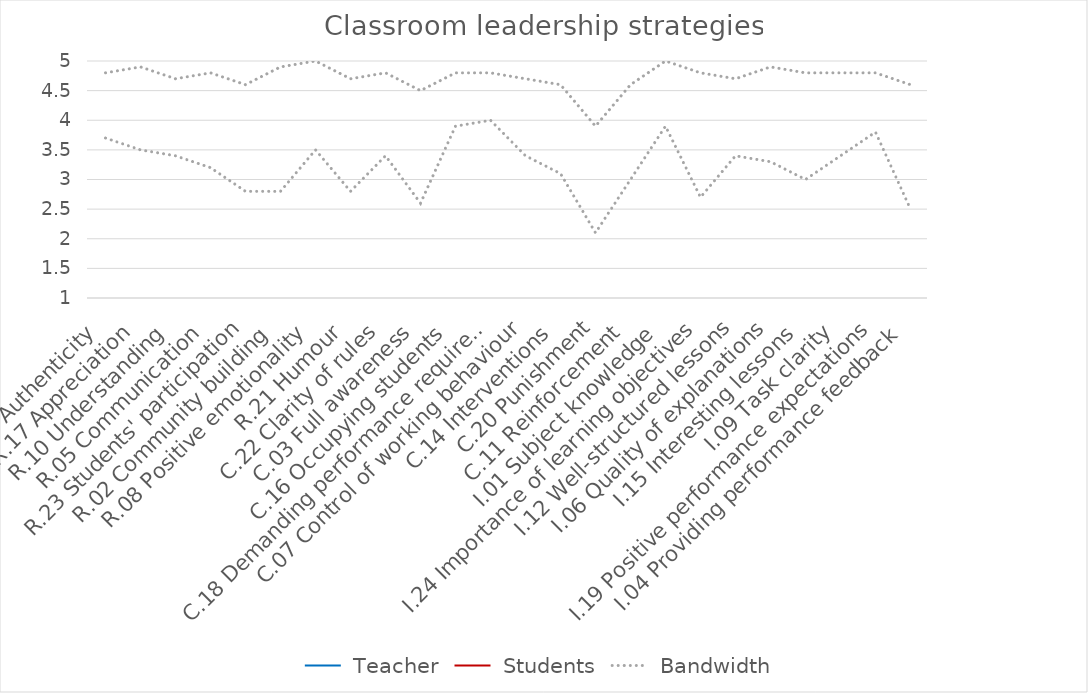
| Category |  Teacher |  Students |  Bandwidth |
|---|---|---|---|
| R.13 Authenticity | 0 | 0 | 4.8 |
| R.17 Appreciation | 0 | 0 | 4.9 |
| R.10 Understanding | 0 | 0 | 4.7 |
| R.05 Communication | 0 | 0 | 4.8 |
| R.23 Students' participation | 0 | 0 | 4.6 |
| R.02 Community building | 0 | 0 | 4.9 |
| R.08 Positive emotionality | 0 | 0 | 5 |
| R.21 Humour | 0 | 0 | 4.7 |
| C.22 Clarity of rules | 0 | 0 | 4.8 |
| C.03 Full awareness | 0 | 0 | 4.5 |
| C.16 Occupying students | 0 | 0 | 4.8 |
| C.18 Demanding performance requirements | 0 | 0 | 4.8 |
| C.07 Control of working behaviour | 0 | 0 | 4.7 |
| C.14 Interventions | 0 | 0 | 4.6 |
| C.20 Punishment | 0 | 0 | 3.9 |
| C.11 Reinforcement | 0 | 0 | 4.6 |
| I.01 Subject knowledge | 0 | 0 | 5 |
| I.24 Importance of learning objectives | 0 | 0 | 4.8 |
| I.12 Well-structured lessons | 0 | 0 | 4.7 |
| I.06 Quality of explanations | 0 | 0 | 4.9 |
| I.15 Interesting lessons | 0 | 0 | 4.8 |
| I.09 Task clarity | 0 | 0 | 4.8 |
| I.19 Positive performance expectations | 0 | 0 | 4.8 |
| I.04 Providing performance feedback | 0 | 0 | 4.6 |